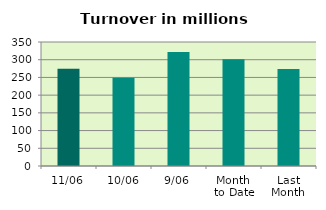
| Category | Series 0 |
|---|---|
| 11/06 | 274.384 |
| 10/06 | 248.801 |
| 9/06 | 321.893 |
| Month 
to Date | 301.599 |
| Last
Month | 273.813 |